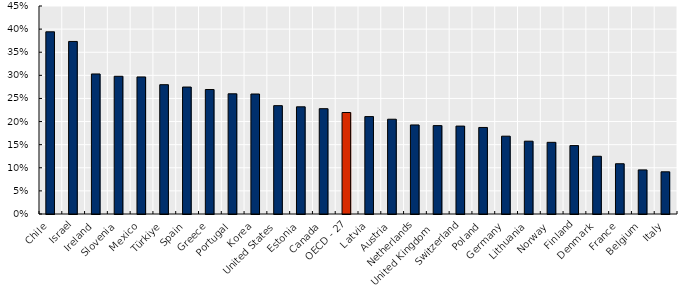
| Category | Series 0 |
|---|---|
| Chile | 0.394 |
| Israel | 0.373 |
| Ireland | 0.303 |
| Slovenia | 0.298 |
| Mexico | 0.297 |
| Türkiye | 0.28 |
| Spain | 0.275 |
| Greece | 0.269 |
| Portugal | 0.26 |
| Korea | 0.26 |
| United States | 0.234 |
| Estonia | 0.232 |
| Canada | 0.228 |
| OECD - 27 | 0.22 |
| Latvia | 0.211 |
| Austria | 0.205 |
| Netherlands | 0.193 |
| United Kingdom  | 0.191 |
| Switzerland | 0.19 |
| Poland | 0.187 |
| Germany | 0.168 |
| Lithuania | 0.158 |
| Norway | 0.155 |
| Finland | 0.148 |
| Denmark | 0.125 |
| France | 0.109 |
| Belgium | 0.095 |
| Italy | 0.091 |